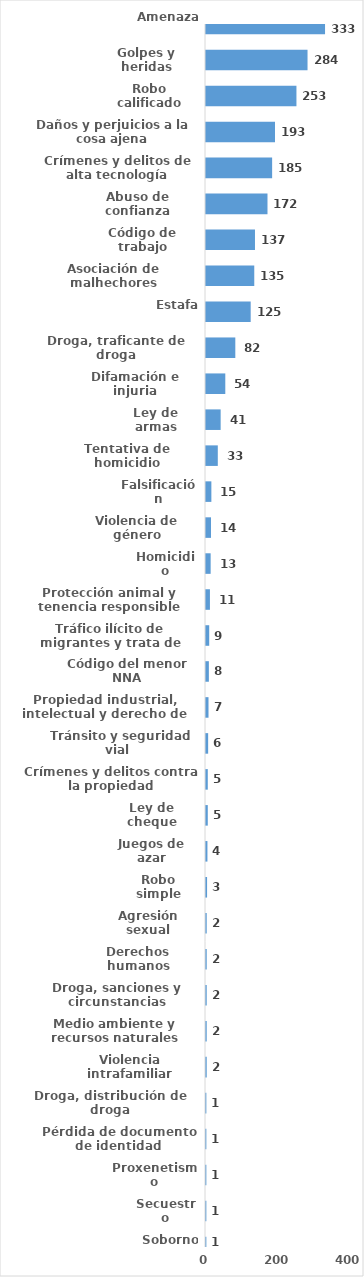
| Category | Series 0 |
|---|---|
| Amenaza | 333 |
| Golpes y heridas | 284 |
| Robo calificado | 253 |
| Daños y perjuicios a la cosa ajena | 193 |
| Crímenes y delitos de alta tecnología | 185 |
| Abuso de confianza | 172 |
| Código de trabajo | 137 |
| Asociación de malhechores | 135 |
| Estafa | 125 |
| Droga, traficante de droga | 82 |
| Difamación e injuria | 54 |
| Ley de armas | 41 |
| Tentativa de homicidio | 33 |
| Falsificación | 15 |
| Violencia de género | 14 |
| Homicidio | 13 |
| Protección animal y tenencia responsible | 11 |
| Tráfico ilícito de migrantes y trata de personas | 9 |
| Código del menor NNA | 8 |
| Propiedad industrial, intelectual y derecho de autor | 7 |
| Tránsito y seguridad vial  | 6 |
| Crímenes y delitos contra la propiedad | 5 |
| Ley de cheque | 5 |
| Juegos de azar | 4 |
| Robo simple | 3 |
| Agresión sexual | 2 |
| Derechos humanos | 2 |
| Droga, sanciones y circunstancias agravantes | 2 |
| Medio ambiente y recursos naturales | 2 |
| Violencia intrafamiliar | 2 |
| Droga, distribución de droga | 1 |
| Pérdida de documento de identidad | 1 |
| Proxenetismo | 1 |
| Secuestro | 1 |
| Soborno | 1 |